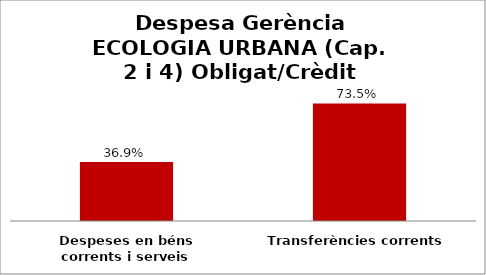
| Category | Series 0 |
|---|---|
| Despeses en béns corrents i serveis | 0.369 |
| Transferències corrents | 0.735 |